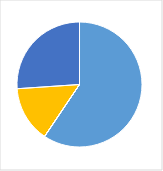
| Category | Series 0 |
|---|---|
| 0 | 0.594 |
| 1 | 0 |
| 2 | 0 |
| 3 | 0.145 |
| 4 | 0.261 |